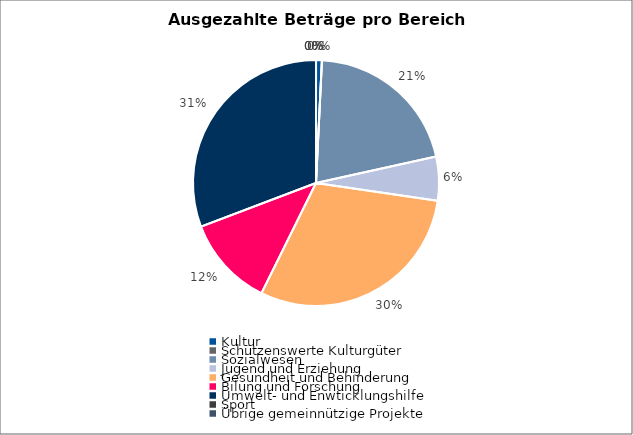
| Category | Series 0 |
|---|---|
| Kultur | 2000 |
| Schützenswerte Kulturgüter | 0 |
| Sozialwesen | 54000 |
| Jugend und Erziehung | 15000 |
| Gesundheit und Behinderung | 78000 |
| Bilung und Forschung | 31000 |
| Umwelt- und Enwticklungshilfe | 80000 |
| Sport | 0 |
| Übrige gemeinnützige Projekte | 0 |